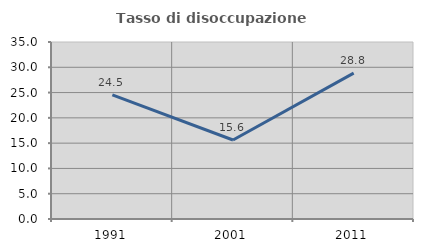
| Category | Tasso di disoccupazione giovanile  |
|---|---|
| 1991.0 | 24.528 |
| 2001.0 | 15.625 |
| 2011.0 | 28.846 |